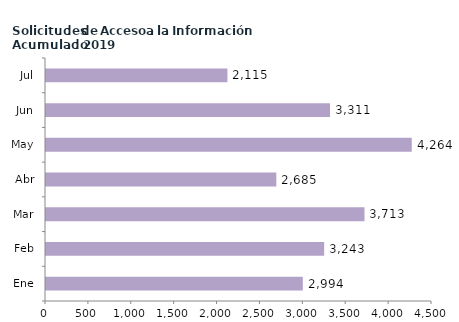
| Category | Series 0 |
|---|---|
| Ene | 2994 |
| Feb | 3243 |
| Mar | 3713 |
| Abr | 2685 |
| May | 4264 |
| Jun | 3311 |
| Jul | 2115 |